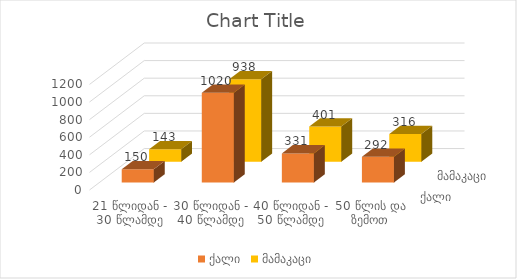
| Category | ქალი | მამაკაცი |
|---|---|---|
| 21 წლიდან - 30 წლამდე | 150 | 143 |
| 30 წლიდან - 40 წლამდე | 1020 | 938 |
| 40 წლიდან - 50 წლამდე | 331 | 401 |
| 50 წლის და ზემოთ | 292 | 316 |